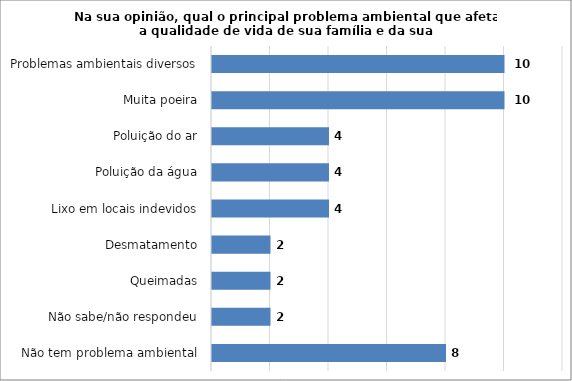
| Category | Series 0 |
|---|---|
| Não tem problema ambiental | 8 |
| Não sabe/não respondeu | 2 |
| Queimadas | 2 |
| Desmatamento | 2 |
| Lixo em locais indevidos | 4 |
| Poluição da água | 4 |
| Poluição do ar | 4 |
| Muita poeira | 10 |
| Problemas ambientais diversos | 10 |